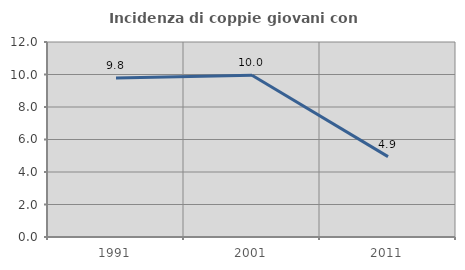
| Category | Incidenza di coppie giovani con figli |
|---|---|
| 1991.0 | 9.778 |
| 2001.0 | 9.955 |
| 2011.0 | 4.945 |